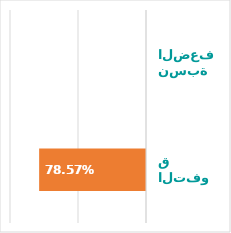
| Category | Series 0 |
|---|---|
| نسبة التفوق | 0.786 |
| نسبة الضعف | 0 |